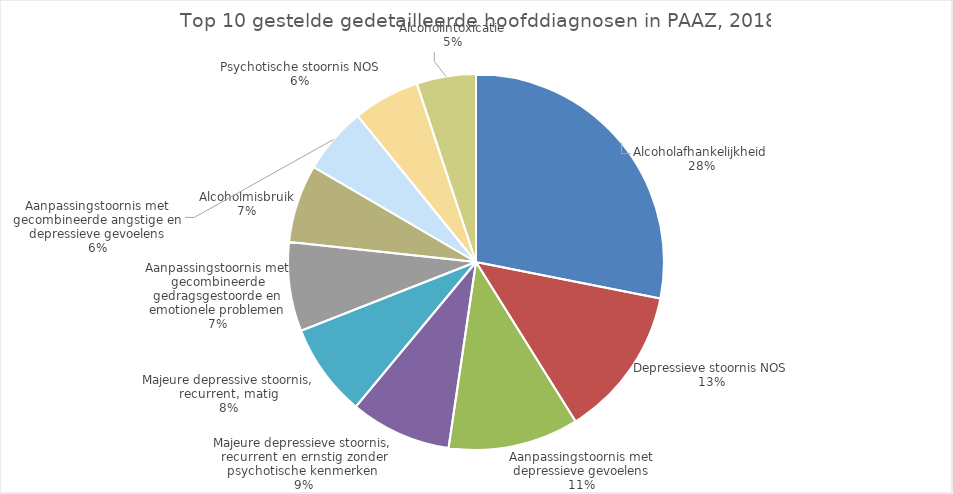
| Category | Series 0 | Series 1 |
|---|---|---|
| Alcoholafhankelijkheid | 7323 | 28.115 |
| Depressieve stoornis NOS | 3385 | 12.996 |
| Aanpassingstoornis met depressieve gevoelens | 2923 | 11.222 |
| Majeure depressieve stoornis, recurrent en ernstig zonder psychotische kenmerken  | 2265 | 8.696 |
| Majeure depressive stoornis, recurrent, matig | 2088 | 8.016 |
| Aanpassingstoornis met gecombineerde gedragsgestoorde en emotionele problemen | 1995 | 7.659 |
| Alcoholmisbruik | 1750 | 6.719 |
| Aanpassingstoornis met gecombineerde angstige en depressieve gevoelens | 1496 | 5.743 |
| Psychotische stoornis NOS | 1494 | 5.736 |
| Alcoholintoxicatie | 1328 | 5.098 |